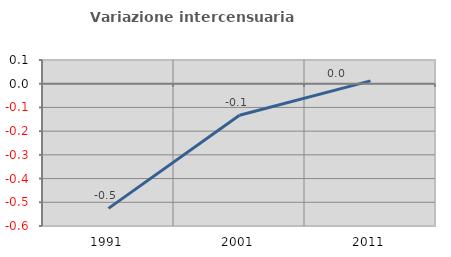
| Category | Variazione intercensuaria annua |
|---|---|
| 1991.0 | -0.526 |
| 2001.0 | -0.133 |
| 2011.0 | 0.012 |